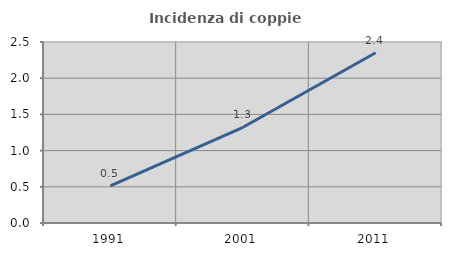
| Category | Incidenza di coppie miste |
|---|---|
| 1991.0 | 0.514 |
| 2001.0 | 1.322 |
| 2011.0 | 2.352 |